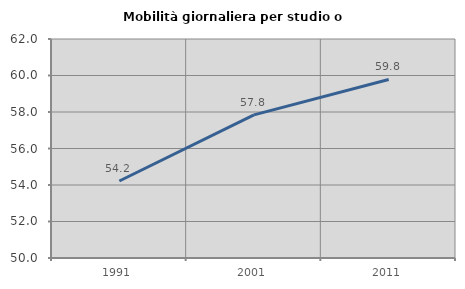
| Category | Mobilità giornaliera per studio o lavoro |
|---|---|
| 1991.0 | 54.22 |
| 2001.0 | 57.842 |
| 2011.0 | 59.783 |